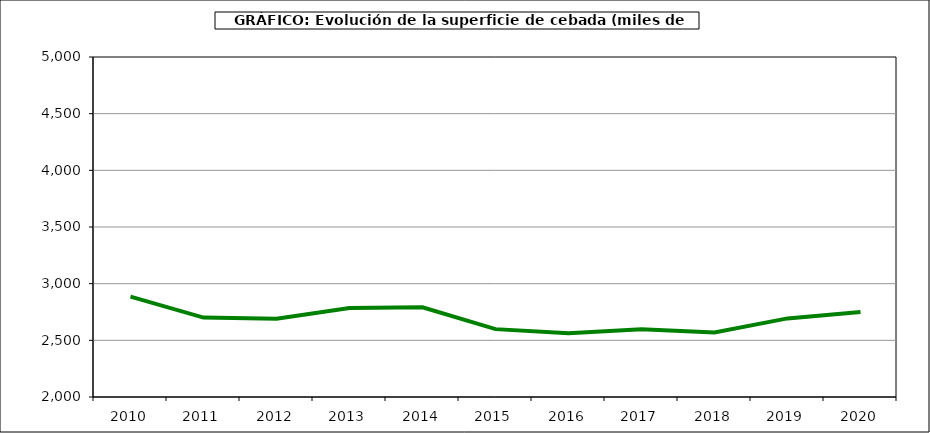
| Category | Superficie |
|---|---|
| 2010.0 | 2885.612 |
| 2011.0 | 2700.679 |
| 2012.0 | 2691.086 |
| 2013.0 | 2784.281 |
| 2014.0 | 2792.226 |
| 2015.0 | 2598.896 |
| 2016.0 | 2563.195 |
| 2017.0 | 2597.527 |
| 2018.0 | 2569.462 |
| 2019.0 | 2693.508 |
| 2020.0 | 2749.039 |